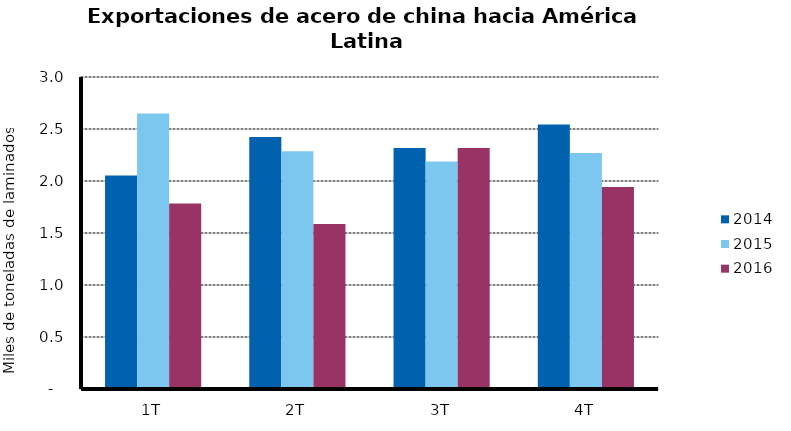
| Category | 2014 | 2015 | 2016 |
|---|---|---|---|
| 1T | 2.054 | 2.648 | 1.785 |
| 2T | 2.424 | 2.287 | 1.586 |
| 3T | 2.318 | 2.186 | 2.318 |
| 4T | 2.544 | 2.27 | 1.941 |